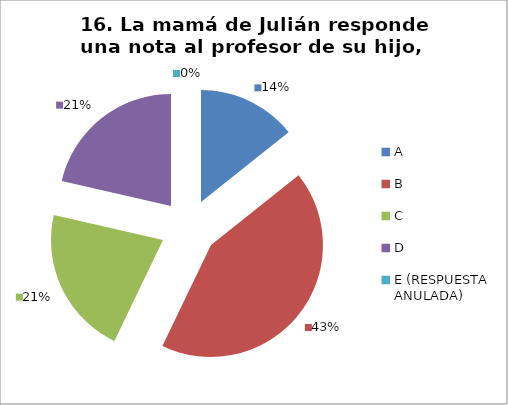
| Category | CANTIDAD DE RESPUESTAS PREGUNTA (16) | PORCENTAJE |
|---|---|---|
| A | 4 | 0.143 |
| B | 12 | 0.429 |
| C | 6 | 0.214 |
| D | 6 | 0.214 |
| E (RESPUESTA ANULADA) | 0 | 0 |